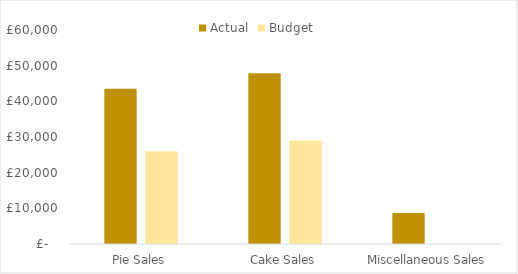
| Category | Actual | Budget |
|---|---|---|
| Pie Sales | 43530 | 26000 |
| Cake Sales | 47883 | 29000 |
| Miscellaneous Sales | 8706 | 0 |